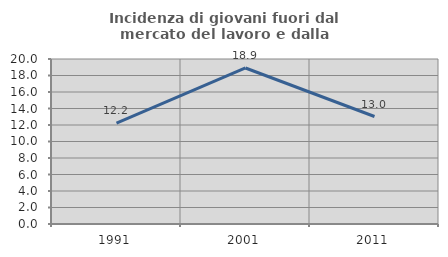
| Category | Incidenza di giovani fuori dal mercato del lavoro e dalla formazione  |
|---|---|
| 1991.0 | 12.219 |
| 2001.0 | 18.911 |
| 2011.0 | 13.027 |